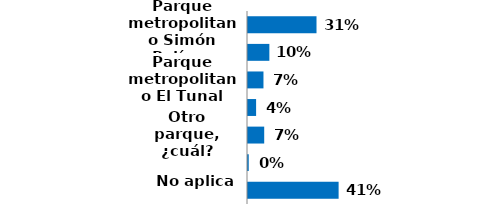
| Category | Series 0 |
|---|---|
| Parque metropolitano Simón Bolívar | 0.31 |
| Parque metropolitano El Lago (Novios) | 0.097 |
| Parque metropolitano El Tunal | 0.07 |
| Parque metropolitano Cayetano Cañizales | 0.037 |
| Otro parque, ¿cuál? | 0.073 |
| Ns/Nr | 0.003 |
| No aplica  | 0.41 |